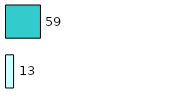
| Category | Series 0 | Series 1 |
|---|---|---|
| 0 | 13 | 59 |